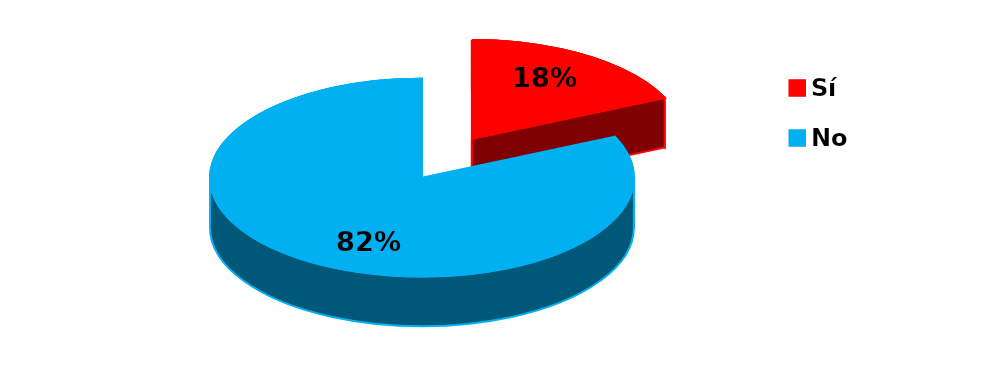
| Category | Series 0 |
|---|---|
| 0 | 2 |
| 1 | 9 |